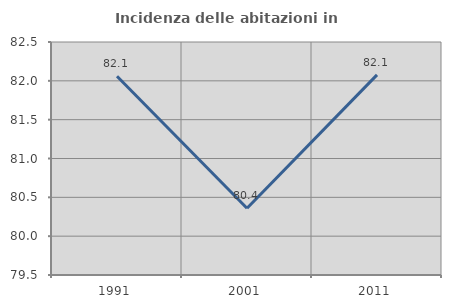
| Category | Incidenza delle abitazioni in proprietà  |
|---|---|
| 1991.0 | 82.058 |
| 2001.0 | 80.36 |
| 2011.0 | 82.077 |